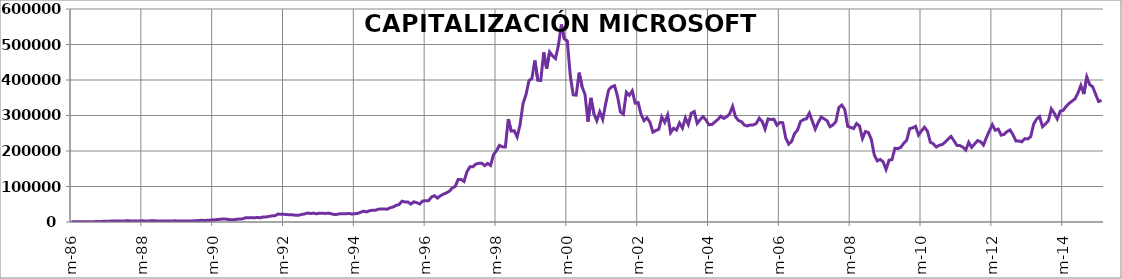
| Category | CAPITALIZACIÓN MICROSOFT (Mill $) |
|---|---|
| 1986-03-13 | 692.02 |
| 1986-04-13 | 710.56 |
| 1986-05-13 | 797.06 |
| 1986-06-13 | 778.52 |
| 1986-07-13 | 692.02 |
| 1986-08-13 | 759.16 |
| 1986-09-13 | 720.88 |
| 1986-10-13 | 848.47 |
| 1986-11-13 | 1074.95 |
| 1986-12-13 | 1205.82 |
| 1987-01-13 | 1531.2 |
| 1987-02-13 | 1939.52 |
| 1987-03-13 | 2111.78 |
| 1987-04-13 | 2360.6 |
| 1987-05-13 | 3107.06 |
| 1987-06-13 | 2507.34 |
| 1987-07-13 | 2594.99 |
| 1987-08-13 | 2693.04 |
| 1987-09-13 | 3039.47 |
| 1987-10-13 | 3830.39 |
| 1987-11-13 | 2543.4 |
| 1987-12-13 | 2530.22 |
| 1988-01-13 | 2991.46 |
| 1988-02-13 | 2912.39 |
| 1988-03-13 | 3294.56 |
| 1988-04-13 | 3034.62 |
| 1988-05-13 | 3021.31 |
| 1988-06-13 | 3320.78 |
| 1988-07-13 | 3566.45 |
| 1988-08-13 | 2778.36 |
| 1988-09-13 | 2885.22 |
| 1988-10-13 | 2751.64 |
| 1988-11-13 | 2555.7 |
| 1988-12-13 | 2562.41 |
| 1989-01-13 | 2856.22 |
| 1989-02-13 | 3300.82 |
| 1989-03-13 | 2842.75 |
| 1989-04-13 | 2643.18 |
| 1989-05-13 | 2941.38 |
| 1989-06-13 | 3104.04 |
| 1989-07-13 | 2873.6 |
| 1989-08-13 | 3141.02 |
| 1989-09-13 | 3385.78 |
| 1989-10-13 | 4012.07 |
| 1989-11-13 | 4810.39 |
| 1989-12-13 | 4366.88 |
| 1990-01-13 | 4764 |
| 1990-02-13 | 5241.09 |
| 1990-03-13 | 5877.21 |
| 1990-04-13 | 6679.29 |
| 1990-05-13 | 7246.26 |
| 1990-06-13 | 8463.19 |
| 1990-07-13 | 8670.63 |
| 1990-08-13 | 7298.59 |
| 1990-09-13 | 6456.44 |
| 1990-10-13 | 6480.84 |
| 1990-11-13 | 7802.59 |
| 1990-12-13 | 8286.22 |
| 1991-01-13 | 8884.2 |
| 1991-02-13 | 12016.45 |
| 1991-03-13 | 11617.39 |
| 1991-04-13 | 12397.67 |
| 1991-05-13 | 11920.84 |
| 1991-06-13 | 12850.8 |
| 1991-07-13 | 11808.88 |
| 1991-08-13 | 14326.95 |
| 1991-09-13 | 14413.78 |
| 1991-10-13 | 15615.71 |
| 1991-11-13 | 17597.62 |
| 1991-12-13 | 17972.09 |
| 1992-01-13 | 22399.04 |
| 1992-02-13 | 21584.13 |
| 1992-03-13 | 21597.16 |
| 1992-04-13 | 20972.45 |
| 1992-05-13 | 20124.63 |
| 1992-06-13 | 20080 |
| 1992-07-13 | 18867.44 |
| 1992-08-13 | 19103.28 |
| 1992-09-13 | 21225.87 |
| 1992-10-13 | 22708.31 |
| 1992-11-13 | 25376.95 |
| 1992-12-13 | 23758.47 |
| 1993-01-13 | 25099.4 |
| 1993-02-13 | 23002.05 |
| 1993-03-13 | 24938.95 |
| 1993-04-13 | 24903.92 |
| 1993-05-13 | 24028.26 |
| 1993-06-13 | 25044.03 |
| 1993-07-13 | 23292.04 |
| 1993-08-13 | 21180.98 |
| 1993-09-13 | 21497.64 |
| 1993-10-13 | 23432.78 |
| 1993-11-13 | 23088.75 |
| 1993-12-13 | 23094.87 |
| 1994-01-13 | 24230.11 |
| 1994-02-13 | 22349.88 |
| 1994-03-13 | 23376.81 |
| 1994-04-13 | 24270.41 |
| 1994-05-13 | 27594.64 |
| 1994-06-13 | 30450.5 |
| 1994-07-13 | 28506.85 |
| 1994-08-13 | 31818.25 |
| 1994-09-13 | 33150.01 |
| 1994-10-13 | 33224.8 |
| 1994-11-13 | 36126.53 |
| 1994-12-13 | 36544.59 |
| 1995-01-13 | 36544.59 |
| 1995-02-13 | 36107.8 |
| 1995-03-13 | 40184.49 |
| 1995-04-13 | 42222.84 |
| 1995-05-13 | 46934.14 |
| 1995-06-13 | 49120.54 |
| 1995-07-13 | 58637.19 |
| 1995-08-13 | 56514.23 |
| 1995-09-13 | 56294.6 |
| 1995-10-13 | 50511.42 |
| 1995-11-13 | 56819.71 |
| 1995-12-13 | 54344.05 |
| 1996-01-13 | 50790.19 |
| 1996-02-13 | 59008.45 |
| 1996-03-13 | 59920.14 |
| 1996-04-13 | 60068.62 |
| 1996-05-13 | 70463.69 |
| 1996-06-13 | 74027.69 |
| 1996-07-13 | 67228.19 |
| 1996-08-13 | 73883.69 |
| 1996-09-13 | 78370.56 |
| 1996-10-13 | 81863.56 |
| 1996-11-13 | 86564.94 |
| 1996-12-13 | 95615 |
| 1997-01-13 | 100096.9 |
| 1997-02-13 | 119518.8 |
| 1997-03-13 | 119864.4 |
| 1997-04-13 | 114299.8 |
| 1997-05-13 | 141671.6 |
| 1997-06-13 | 155333.1 |
| 1997-07-13 | 155482.9 |
| 1997-08-13 | 163047.3 |
| 1997-09-13 | 165294.2 |
| 1997-10-13 | 165818.6 |
| 1997-11-13 | 158755.3 |
| 1997-12-13 | 165014.9 |
| 1998-01-13 | 159434 |
| 1998-02-13 | 190053.8 |
| 1998-03-13 | 200568.1 |
| 1998-04-13 | 215785.7 |
| 1998-05-13 | 211676.9 |
| 1998-06-13 | 211294 |
| 1998-07-13 | 289682.3 |
| 1998-08-13 | 256109.3 |
| 1998-09-13 | 256879.3 |
| 1998-10-13 | 239611.8 |
| 1998-11-13 | 274292.2 |
| 1998-12-13 | 334137.8 |
| 1999-01-13 | 358605.9 |
| 1999-02-13 | 398075.4 |
| 1999-03-13 | 404226.4 |
| 1999-04-13 | 454853.1 |
| 1999-05-13 | 399337.1 |
| 1999-06-13 | 398738.8 |
| 1999-07-13 | 477848.6 |
| 1999-08-13 | 432232.8 |
| 1999-09-13 | 479124.5 |
| 1999-10-13 | 468198.2 |
| 1999-11-13 | 460209.1 |
| 1999-12-13 | 498586.7 |
| 2000-01-13 | 556314.4 |
| 2000-02-13 | 515679.3 |
| 2000-03-13 | 510075.4 |
| 2000-04-13 | 412484.4 |
| 2000-05-13 | 358158.8 |
| 2000-06-13 | 357185.5 |
| 2000-07-13 | 420663.3 |
| 2000-08-13 | 381195.3 |
| 2000-09-13 | 359158.9 |
| 2000-10-13 | 282854.1 |
| 2000-11-13 | 349620.8 |
| 2000-12-13 | 305276.3 |
| 2001-01-13 | 285280 |
| 2001-02-13 | 310275.3 |
| 2001-03-13 | 289111.4 |
| 2001-04-13 | 333137.9 |
| 2001-05-13 | 371820.1 |
| 2001-06-13 | 380460.6 |
| 2001-07-13 | 383958.9 |
| 2001-08-13 | 354303.6 |
| 2001-09-13 | 309901.3 |
| 2001-10-13 | 303648.7 |
| 2001-11-13 | 365692.6 |
| 2001-12-13 | 356913.8 |
| 2002-01-13 | 369516.4 |
| 2002-02-13 | 334768.9 |
| 2002-03-13 | 336333.8 |
| 2002-04-13 | 302886.7 |
| 2002-05-13 | 285340.6 |
| 2002-06-13 | 293626.3 |
| 2002-07-13 | 280845.8 |
| 2002-08-13 | 253069.9 |
| 2002-09-13 | 257695.6 |
| 2002-10-13 | 261280.9 |
| 2002-11-13 | 295979.4 |
| 2002-12-13 | 280688.6 |
| 2003-01-13 | 301725.4 |
| 2003-02-13 | 251428.9 |
| 2003-03-13 | 264003 |
| 2003-04-13 | 258973.3 |
| 2003-05-13 | 279035.2 |
| 2003-06-13 | 264648.7 |
| 2003-07-13 | 293196.3 |
| 2003-08-13 | 274848.1 |
| 2003-09-13 | 306468.2 |
| 2003-10-13 | 311226.4 |
| 2003-11-13 | 277772.1 |
| 2003-12-13 | 288152.2 |
| 2004-01-13 | 296585.9 |
| 2004-02-13 | 287022.7 |
| 2004-03-13 | 273961.4 |
| 2004-04-13 | 274717.1 |
| 2004-05-13 | 281741.2 |
| 2004-06-13 | 288973.6 |
| 2004-07-13 | 297933.3 |
| 2004-08-13 | 291672.3 |
| 2004-09-13 | 296281.1 |
| 2004-10-13 | 304761.8 |
| 2004-11-13 | 325821.3 |
| 2004-12-13 | 296250.7 |
| 2005-01-13 | 285823.3 |
| 2005-02-13 | 282559.1 |
| 2005-03-13 | 272984.6 |
| 2005-04-13 | 270540.9 |
| 2005-05-13 | 273349.9 |
| 2005-06-13 | 273458.1 |
| 2005-07-13 | 277239.5 |
| 2005-08-13 | 292257.6 |
| 2005-09-13 | 283672.3 |
| 2005-10-13 | 261752.4 |
| 2005-11-13 | 290386.6 |
| 2005-12-13 | 288790.9 |
| 2006-01-13 | 289428.4 |
| 2006-02-13 | 272697.5 |
| 2006-03-13 | 280137.3 |
| 2006-04-13 | 279724.1 |
| 2006-05-13 | 236361.8 |
| 2006-06-13 | 219427.8 |
| 2006-07-13 | 227078.6 |
| 2006-08-13 | 249215.2 |
| 2006-09-13 | 259020.1 |
| 2006-10-13 | 282848.4 |
| 2006-11-13 | 288523.8 |
| 2006-12-13 | 290489.8 |
| 2007-01-13 | 306808.4 |
| 2007-02-13 | 284270.8 |
| 2007-03-13 | 261650.4 |
| 2007-04-13 | 280157.9 |
| 2007-05-13 | 295518.6 |
| 2007-06-13 | 290735.2 |
| 2007-07-13 | 285282.1 |
| 2007-08-13 | 268420.1 |
| 2007-09-13 | 273389.1 |
| 2007-10-13 | 282858.4 |
| 2007-11-13 | 322388.3 |
| 2007-12-13 | 329498.4 |
| 2008-01-13 | 317242.8 |
| 2008-02-13 | 269529.9 |
| 2008-03-13 | 266365.6 |
| 2008-04-13 | 263201.3 |
| 2008-05-13 | 277349.8 |
| 2008-06-13 | 270737.3 |
| 2008-07-13 | 235160.6 |
| 2008-08-13 | 254826.2 |
| 2008-09-13 | 252178.5 |
| 2008-10-13 | 232822.3 |
| 2008-11-13 | 189030.9 |
| 2008-12-13 | 172218.1 |
| 2009-01-13 | 176310.1 |
| 2009-02-13 | 169720.8 |
| 2009-03-13 | 148027.8 |
| 2009-04-13 | 174166 |
| 2009-05-13 | 175769.4 |
| 2009-06-13 | 207630.3 |
| 2009-07-13 | 206740.4 |
| 2009-08-13 | 210470 |
| 2009-09-13 | 221952.5 |
| 2009-10-13 | 230434.3 |
| 2009-11-13 | 263088.2 |
| 2009-12-13 | 265041.6 |
| 2010-01-13 | 269481.1 |
| 2010-02-13 | 244958.8 |
| 2010-03-13 | 256711.3 |
| 2010-04-13 | 267060.4 |
| 2010-05-13 | 256254.4 |
| 2010-06-13 | 224879.9 |
| 2010-07-13 | 220235.1 |
| 2010-08-13 | 211146.9 |
| 2010-09-13 | 216010 |
| 2010-10-13 | 217988.6 |
| 2010-11-13 | 224753.4 |
| 2010-12-13 | 233095.1 |
| 2011-01-13 | 241180 |
| 2011-02-13 | 228964.8 |
| 2011-03-13 | 215773 |
| 2011-04-13 | 215352.9 |
| 2011-05-13 | 211072.1 |
| 2011-06-13 | 202723.6 |
| 2011-07-13 | 224564.4 |
| 2011-08-13 | 210294.3 |
| 2011-09-13 | 219756.1 |
| 2011-10-13 | 229376.8 |
| 2011-11-13 | 226371.6 |
| 2011-12-13 | 216697.7 |
| 2012-01-13 | 237644.1 |
| 2012-02-13 | 256589.6 |
| 2012-03-13 | 274126.3 |
| 2012-04-13 | 258519.5 |
| 2012-05-13 | 261770.8 |
| 2012-06-13 | 244717.1 |
| 2012-07-13 | 246901.4 |
| 2012-08-13 | 254771.3 |
| 2012-09-13 | 259340.3 |
| 2012-10-13 | 245922.3 |
| 2012-11-13 | 227997.6 |
| 2012-12-13 | 228170.1 |
| 2013-01-13 | 225813.5 |
| 2013-02-13 | 234786.1 |
| 2013-03-13 | 233822.7 |
| 2013-04-13 | 240428.2 |
| 2013-05-13 | 275836.9 |
| 2013-06-13 | 289908.5 |
| 2013-07-13 | 297059.7 |
| 2013-08-13 | 268474.4 |
| 2013-09-13 | 276155.3 |
| 2013-10-13 | 285352 |
| 2013-11-13 | 318516.6 |
| 2013-12-13 | 306286.8 |
| 2014-01-13 | 290333.8 |
| 2014-02-13 | 312162.7 |
| 2014-03-13 | 314486.8 |
| 2014-04-13 | 325434.5 |
| 2014-05-13 | 333885.6 |
| 2014-06-13 | 340576.4 |
| 2014-07-13 | 346779.4 |
| 2014-08-13 | 363174.8 |
| 2014-09-13 | 384719.8 |
| 2014-10-13 | 360331.6 |
| 2014-11-13 | 408927.7 |
| 2014-12-13 | 387001.7 |
| 2015-01-13 | 380945.3 |
| 2015-02-13 | 359899.9 |
| 2015-03-13 | 339472.6 |
| 2015-04-13 | 342589.9 |